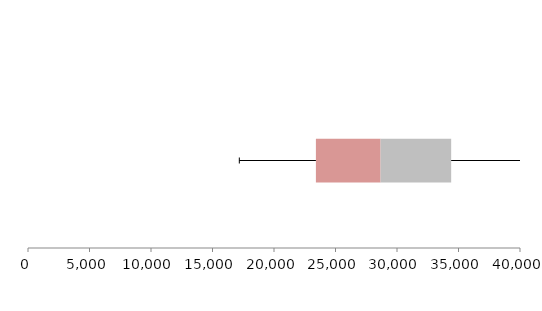
| Category | Series 1 | Series 2 | Series 3 |
|---|---|---|---|
| 0 | 23406.727 | 5258.049 | 5739.321 |